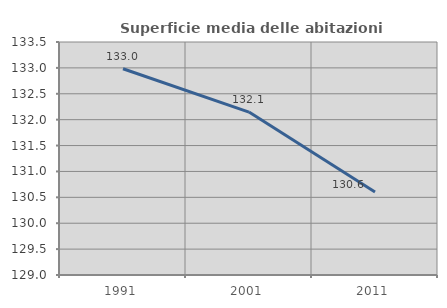
| Category | Superficie media delle abitazioni occupate |
|---|---|
| 1991.0 | 132.983 |
| 2001.0 | 132.147 |
| 2011.0 | 130.603 |